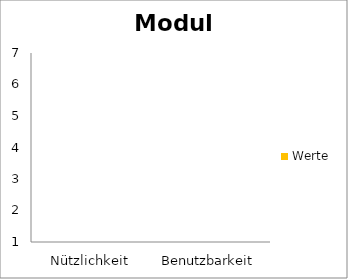
| Category | Werte |
|---|---|
| Nützlichkeit | 0 |
| Benutzbarkeit | 0 |